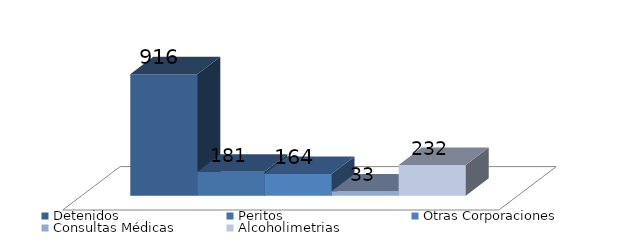
| Category | Detenidos | Peritos | Otras Corporaciones | Consultas Médicas | Alcoholimetrias |
|---|---|---|---|---|---|
| 0 | 916 | 181 | 164 | 33 | 232 |